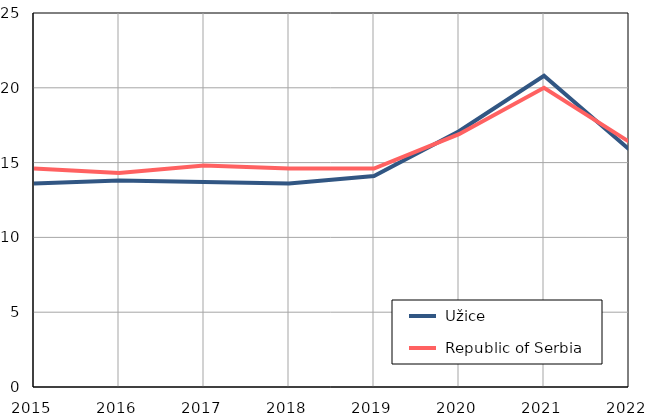
| Category |  Užice |  Republic of Serbia |
|---|---|---|
| 2015.0 | 13.6 | 14.6 |
| 2016.0 | 13.8 | 14.3 |
| 2017.0 | 13.7 | 14.8 |
| 2018.0 | 13.6 | 14.6 |
| 2019.0 | 14.1 | 14.6 |
| 2020.0 | 17.1 | 16.9 |
| 2021.0 | 20.8 | 20 |
| 2022.0 | 15.9 | 16.4 |